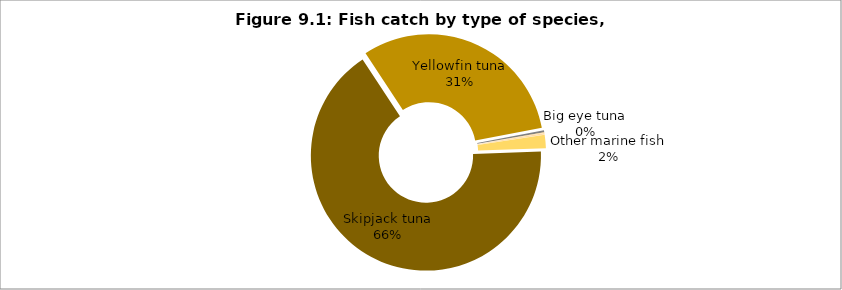
| Category | Series 0 |
|---|---|
| Skipjack tuna | 100099.487 |
| Yellowfin tuna | 47216.696 |
| Big eye tuna | 432.305 |
| Albacore tuna | 10.569 |
| Dogtooth tuna | 10.287 |
|    Little tuna | 90.912 |
| Frigate tuna | 338.613 |
| Other marine fish | 2825.455 |